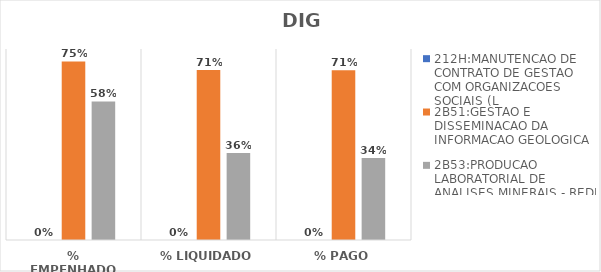
| Category | 212H:MANUTENCAO DE CONTRATO DE GESTAO COM ORGANIZACOES SOCIAIS (L | 2B51:GESTAO E DISSEMINACAO DA INFORMACAO GEOLOGICA | 2B53:PRODUCAO LABORATORIAL DE ANALISES MINERAIS - REDE LAMIN |
|---|---|---|---|
| % EMPENHADO | 0 | 0.748 | 0.58 |
| % LIQUIDADO | 0 | 0.712 | 0.364 |
| % PAGO | 0 | 0.711 | 0.344 |